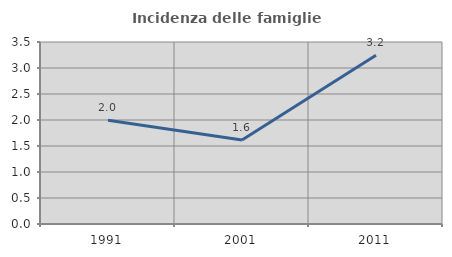
| Category | Incidenza delle famiglie numerose |
|---|---|
| 1991.0 | 1.994 |
| 2001.0 | 1.617 |
| 2011.0 | 3.245 |